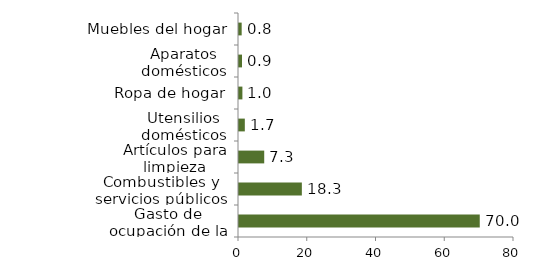
| Category | Vivienda |
|---|---|
| Gasto de ocupación de la vivienda | 70.039 |
| Combustibles y servicios públicos | 18.284 |
| Artículos para limpieza | 7.337 |
| Utensilios domésticos | 1.693 |
| Ropa de hogar | 0.987 |
| Aparatos domésticos | 0.881 |
| Muebles del hogar | 0.778 |